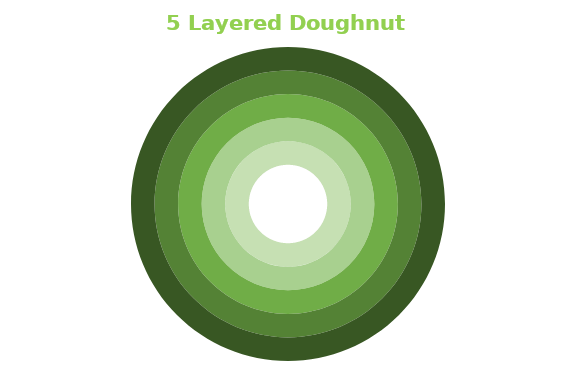
| Category | 1 | 2 | 3 | 4 | 5 |
|---|---|---|---|---|---|
| 0 | 1 | 1 | 1 | 1 | 1 |
| 1 | 0 | 0 | 0 | 0 | 0 |